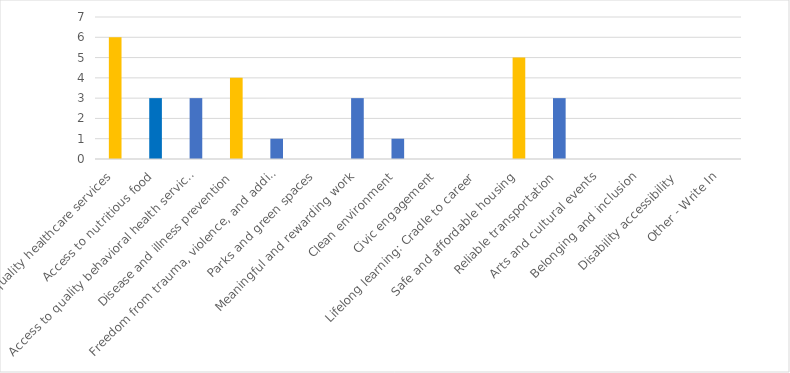
| Category | Number of Responses |
|---|---|
| Access to quality healthcare services | 6 |
| Access to nutritious food | 3 |
| Access to quality behavioral health services | 3 |
| Disease and illness prevention | 4 |
| Freedom from trauma, violence, and addiction | 1 |
| Parks and green spaces | 0 |
| Meaningful and rewarding work | 3 |
| Clean environment | 1 |
| Civic engagement | 0 |
| Lifelong learning: Cradle to career | 0 |
| Safe and affordable housing | 5 |
| Reliable transportation | 3 |
| Arts and cultural events | 0 |
| Belonging and inclusion | 0 |
| Disability accessibility | 0 |
| Other - Write In | 0 |